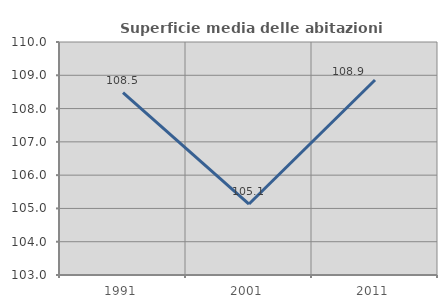
| Category | Superficie media delle abitazioni occupate |
|---|---|
| 1991.0 | 108.476 |
| 2001.0 | 105.132 |
| 2011.0 | 108.859 |